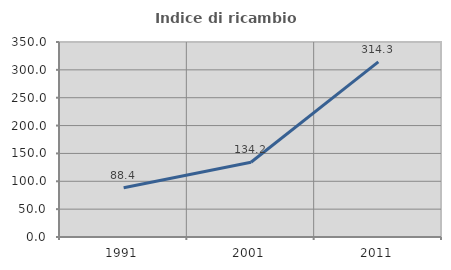
| Category | Indice di ricambio occupazionale  |
|---|---|
| 1991.0 | 88.372 |
| 2001.0 | 134.155 |
| 2011.0 | 314.286 |